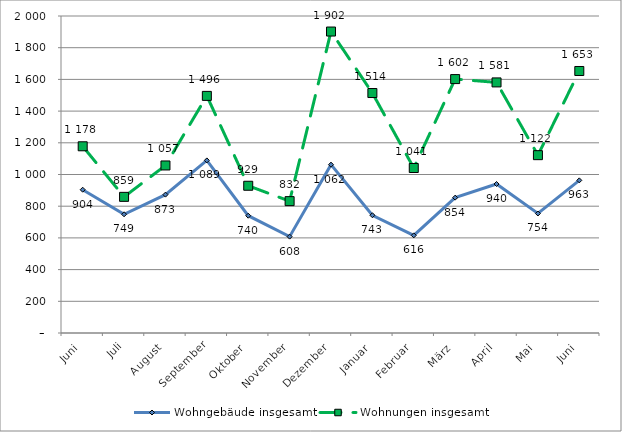
| Category | Wohngebäude insgesamt | Wohnungen insgesamt |
|---|---|---|
| Juni | 904 | 1178 |
| Juli | 749 | 859 |
| August | 873 | 1057 |
| September | 1089 | 1496 |
| Oktober | 740 | 929 |
| November | 608 | 832 |
| Dezember | 1062 | 1902 |
| Januar | 743 | 1514 |
| Februar | 616 | 1041 |
| März | 854 | 1602 |
| April | 940 | 1581 |
| Mai | 754 | 1122 |
| Juni | 963 | 1653 |